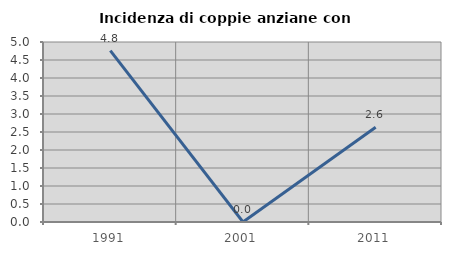
| Category | Incidenza di coppie anziane con figli |
|---|---|
| 1991.0 | 4.762 |
| 2001.0 | 0 |
| 2011.0 | 2.632 |